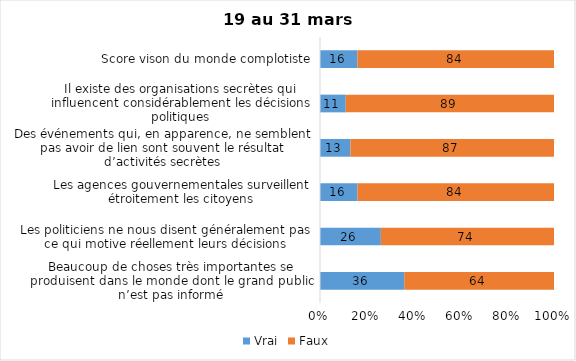
| Category | Vrai | Faux |
|---|---|---|
| Beaucoup de choses très importantes se produisent dans le monde dont le grand public n’est pas informé | 36 | 64 |
| Les politiciens ne nous disent généralement pas ce qui motive réellement leurs décisions | 26 | 74 |
| Les agences gouvernementales surveillent étroitement les citoyens | 16 | 84 |
| Des événements qui, en apparence, ne semblent pas avoir de lien sont souvent le résultat d’activités secrètes | 13 | 87 |
| Il existe des organisations secrètes qui influencent considérablement les décisions politiques | 11 | 89 |
| Score vison du monde complotiste | 16 | 84 |